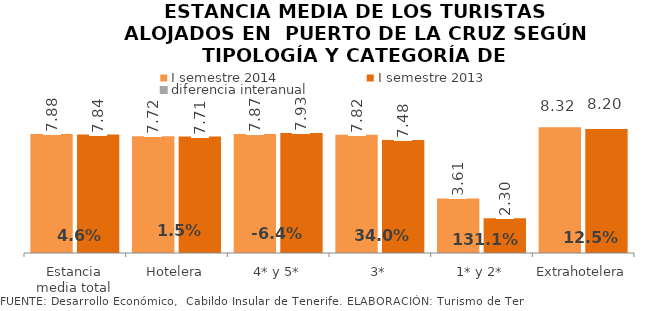
| Category | I semestre 2014 | I semestre 2013 |
|---|---|---|
| Estancia media total | 7.881 | 7.835 |
| Hotelera | 7.724 | 7.709 |
| 4* y 5* | 7.871 | 7.935 |
| 3* | 7.821 | 7.481 |
| 1* y 2* | 3.608 | 2.297 |
| Extrahotelera | 8.325 | 8.199 |